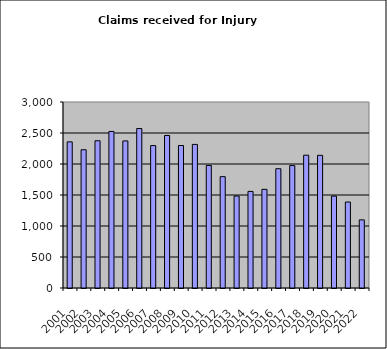
| Category | Series 1 |
|---|---|
| 2001.0 | 2357 |
| 2002.0 | 2230 |
| 2003.0 | 2375 |
| 2004.0 | 2525 |
| 2005.0 | 2372 |
| 2006.0 | 2572 |
| 2007.0 | 2297 |
| 2008.0 | 2460 |
| 2009.0 | 2298 |
| 2010.0 | 2316 |
| 2011.0 | 1977 |
| 2012.0 | 1796 |
| 2013.0 | 1483 |
| 2014.0 | 1558 |
| 2015.0 | 1591 |
| 2016.0 | 1924 |
| 2017.0 | 1975 |
| 2018.0 | 2142 |
| 2019.0 | 2140 |
| 2020.0 | 1482 |
| 2021.0 | 1387 |
| 2022.0 | 1099 |